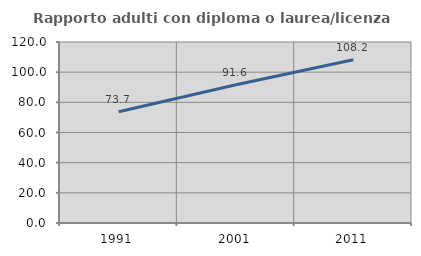
| Category | Rapporto adulti con diploma o laurea/licenza media  |
|---|---|
| 1991.0 | 73.7 |
| 2001.0 | 91.629 |
| 2011.0 | 108.187 |